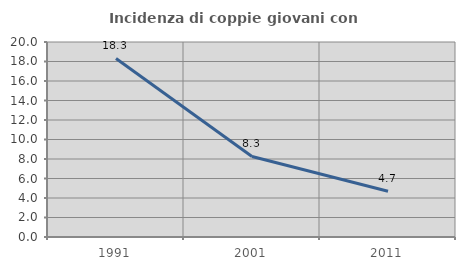
| Category | Incidenza di coppie giovani con figli |
|---|---|
| 1991.0 | 18.313 |
| 2001.0 | 8.263 |
| 2011.0 | 4.694 |